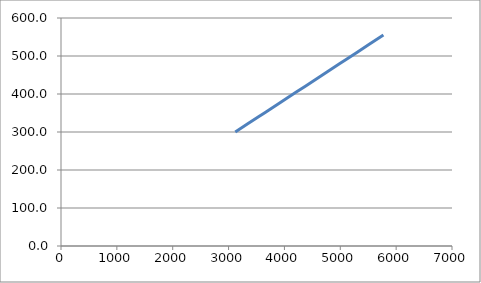
| Category | Series 0 |
|---|---|
| 3120.0 | 300 |
| 3536.0 | 340 |
| 3744.0 | 360 |
| 4056.0 | 390 |
| 4368.0 | 420 |
| 4680.0 | 450 |
| 4992.0 | 480 |
| 5304.0 | 510 |
| 5772.0 | 555 |